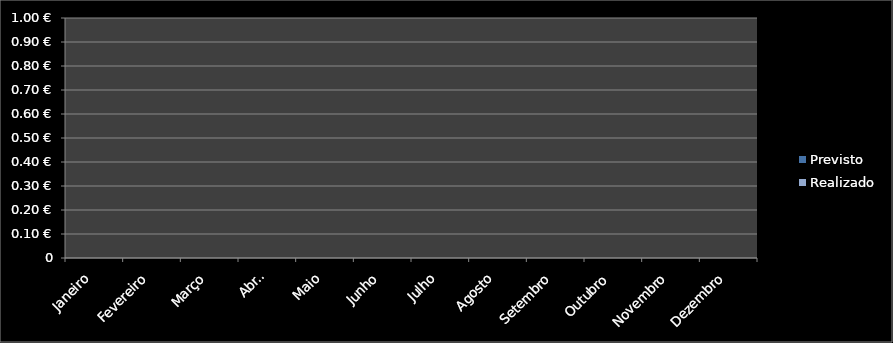
| Category | Previsto | Realizado |
|---|---|---|
| Janeiro | 0 | 0 |
| Fevereiro | 0 | 0 |
| Março | 0 | 0 |
| Abril | 0 | 0 |
| Maio | 0 | 0 |
| Junho | 0 | 0 |
| Julho | 0 | 0 |
| Agosto | 0 | 0 |
| Setembro | 0 | 0 |
| Outubro | 0 | 0 |
| Novembro | 0 | 0 |
| Dezembro | 0 | 0 |